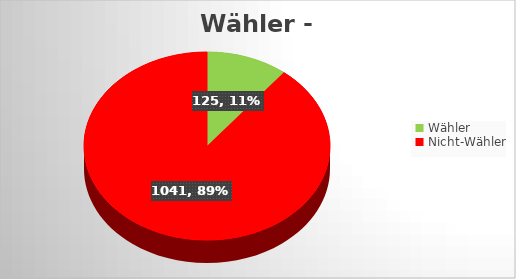
| Category | Series 0 |
|---|---|
| Wähler | 125 |
| Nicht-Wähler | 1041 |